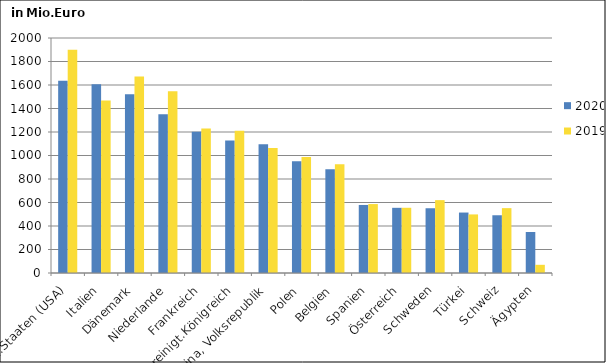
| Category | 2020 | 2019 |
|---|---|---|
| Verein.Staaten (USA) | 1637.17 | 1899.015 |
| Italien | 1606.182 | 1468.961 |
| Dänemark | 1520.55 | 1673.186 |
| Niederlande | 1351.664 | 1547.514 |
| Frankreich | 1202.155 | 1229.069 |
| Vereinigt.Königreich | 1127.641 | 1211.549 |
| China, Volksrepublik | 1094.81 | 1064.22 |
| Polen | 950.403 | 988.096 |
| Belgien | 883.223 | 925.332 |
| Spanien | 579.083 | 586.8 |
| Österreich | 554.736 | 555.108 |
| Schweden | 551.088 | 620.131 |
| Türkei | 514.5 | 498.576 |
| Schweiz | 491.404 | 552.008 |
| Ägypten | 349.138 | 69.713 |